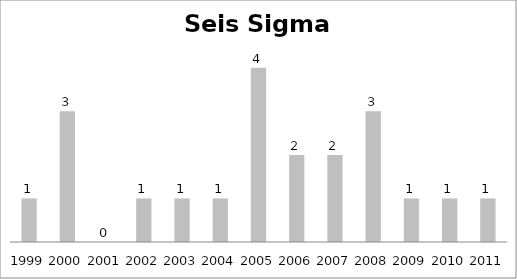
| Category | Seis Sigma  |
|---|---|
| 1999.0 | 1 |
| 2000.0 | 3 |
| 2001.0 | 0 |
| 2002.0 | 1 |
| 2003.0 | 1 |
| 2004.0 | 1 |
| 2005.0 | 4 |
| 2006.0 | 2 |
| 2007.0 | 2 |
| 2008.0 | 3 |
| 2009.0 | 1 |
| 2010.0 | 1 |
| 2011.0 | 1 |